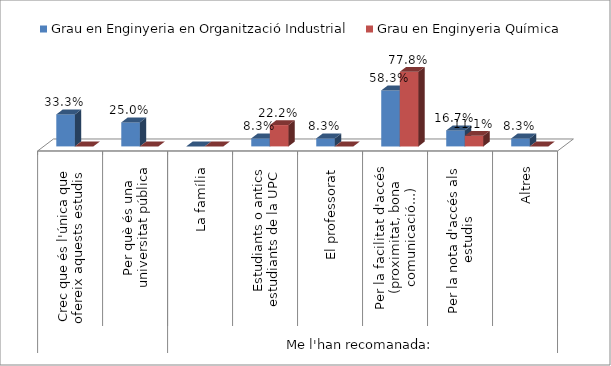
| Category | Grau en Enginyeria en Organització Industrial | Grau en Enginyeria Química |
|---|---|---|
| 0 | 0.333 | 0 |
| 1 | 0.25 | 0 |
| 2 | 0 | 0 |
| 3 | 0.083 | 0.222 |
| 4 | 0.083 | 0 |
| 5 | 0.583 | 0.778 |
| 6 | 0.167 | 0.111 |
| 7 | 0.083 | 0 |